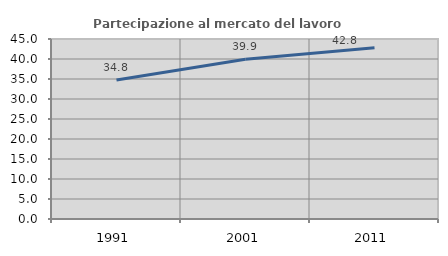
| Category | Partecipazione al mercato del lavoro  femminile |
|---|---|
| 1991.0 | 34.759 |
| 2001.0 | 39.933 |
| 2011.0 | 42.824 |